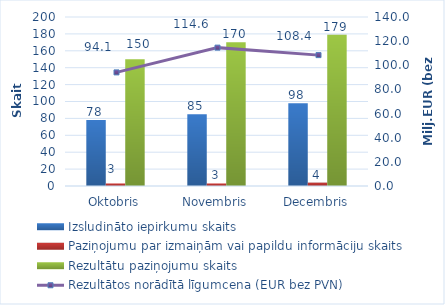
| Category | Izsludināto iepirkumu skaits | Paziņojumu par izmaiņām vai papildu informāciju skaits | Rezultātu paziņojumu skaits |
|---|---|---|---|
| Oktobris | 78 | 3 | 150 |
| Novembris | 85 | 3 | 170 |
| Decembris | 98 | 4 | 179 |